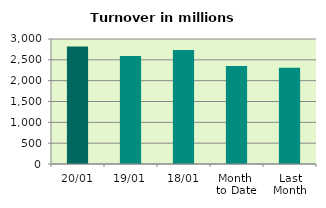
| Category | Series 0 |
|---|---|
| 20/01 | 2818.743 |
| 19/01 | 2592.431 |
| 18/01 | 2733.675 |
| Month 
to Date | 2351.723 |
| Last
Month | 2310.602 |